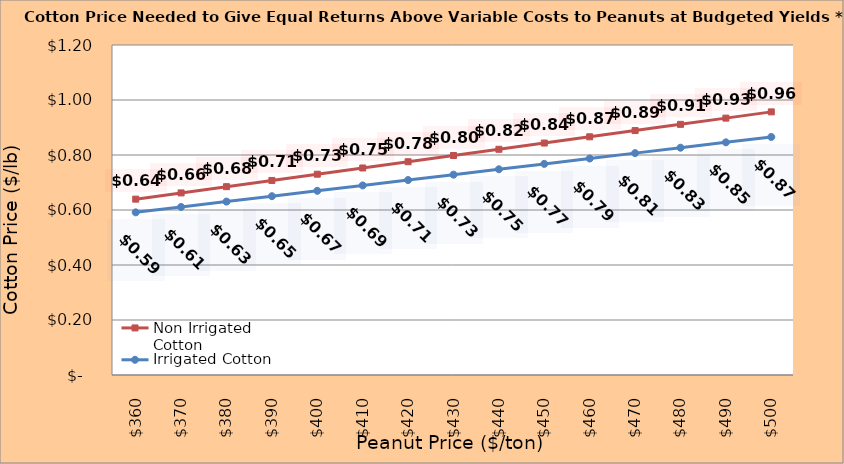
| Category | Non Irrigated Cotton | Irrigated Cotton |
|---|---|---|
| 360.0 | 0.639 | 0.591 |
| 370.0 | 0.662 | 0.611 |
| 380.0 | 0.685 | 0.631 |
| 390.0 | 0.707 | 0.65 |
| 400.0 | 0.73 | 0.67 |
| 410.0 | 0.753 | 0.689 |
| 420.0 | 0.775 | 0.709 |
| 430.0 | 0.798 | 0.729 |
| 440.0 | 0.821 | 0.748 |
| 450.0 | 0.843 | 0.768 |
| 460.0 | 0.866 | 0.787 |
| 470.0 | 0.889 | 0.807 |
| 480.0 | 0.911 | 0.826 |
| 490.0 | 0.934 | 0.846 |
| 500.0 | 0.957 | 0.866 |